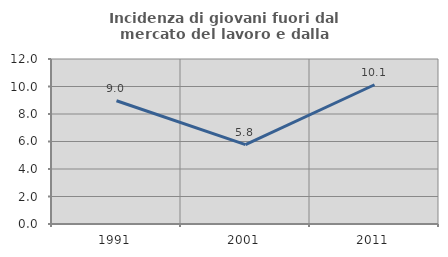
| Category | Incidenza di giovani fuori dal mercato del lavoro e dalla formazione  |
|---|---|
| 1991.0 | 8.966 |
| 2001.0 | 5.769 |
| 2011.0 | 10.127 |